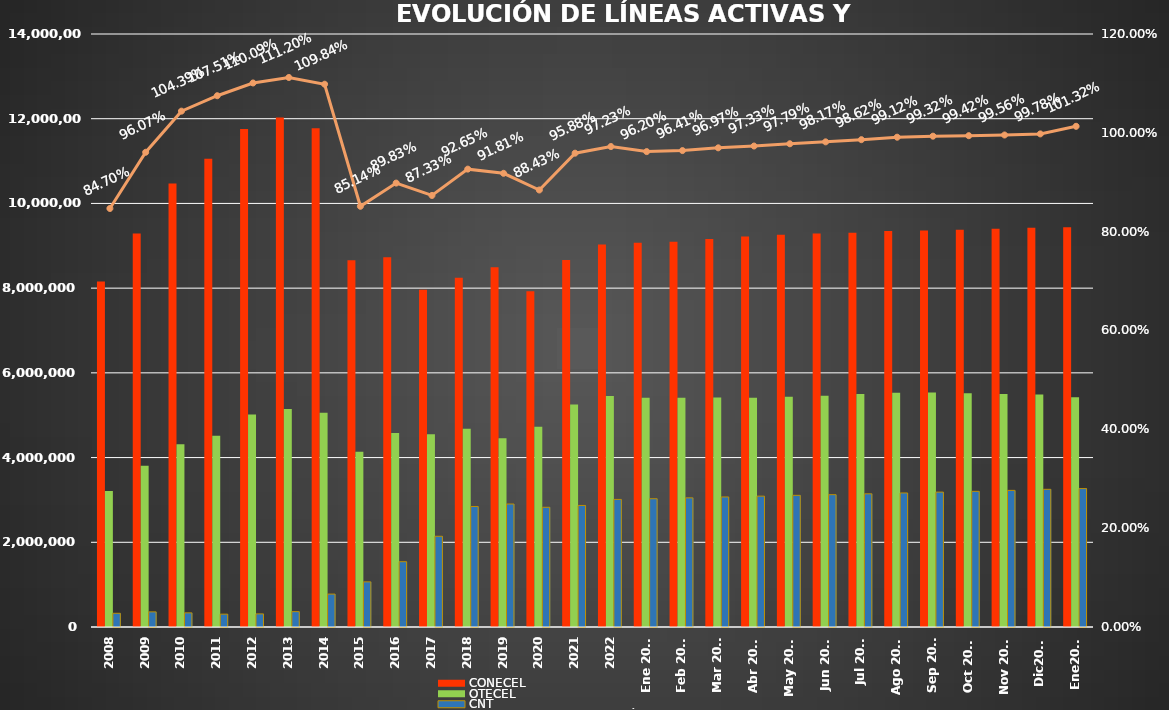
| Category | CONECEL | OTECEL | CNT |
|---|---|---|---|
| 2008 | 8156359 | 3211922 | 323967 |
| 2009 | 9291268 | 3806432 | 356900 |
| 2010 | 10470502 | 4314599 | 333730 |
| 2011 | 11057316 | 4513874 | 303368 |
| 2012 | 11757906 | 5019686 | 309271 |
| 2013 | 12030886 | 5148308 | 362560 |
| 2014 | 11772020 | 5055645 | 776892 |
| 2015 | 8658619 | 4134698 | 1065703 |
| 2016 | 8726823 | 4580092 | 1541219 |
| 2017 | 7960263 | 4549024 | 2142117 |
| 2018 | 8248050 | 4679646 | 2845142 |
| 2019 | 8493054 | 4456356 | 2903690 |
| 2020 | 7929253 | 4729725 | 2826388 |
| 2021 | 8665715 | 5254468 | 2869417 |
| 2022 | 9027737 | 5451115 | 3011899 |
| Ene 2023 | 9073421 | 5411860 | 3028254 |
| Feb 2023 | 9092490 | 5410682 | 3048837 |
| Mar 2023 | 9162562 | 5419670 | 3070611 |
| Abr 2023 | 9220042 | 5409581 | 3089410 |
| May 2023 | 9259499 | 5434175 | 3108405 |
| Jun 2023 | 9290231 | 5458655 | 3123905 |
| Jul 2023 | 9310350 | 5499232 | 3144067 |
| Ago 2023 | 9349530 | 5530451 | 3164614 |
| Sep 2023 | 9361007 | 5536629 | 3184663 |
| Oct 2023 | 9378363 | 5518632 | 3202774 |
| Nov 2023 | 9399776 | 5500199 | 3225513 |
| Dic2023 | 9425714 | 5489576 | 3250322 |
| Ene2024 | 9435179 | 5426792 | 3267658 |